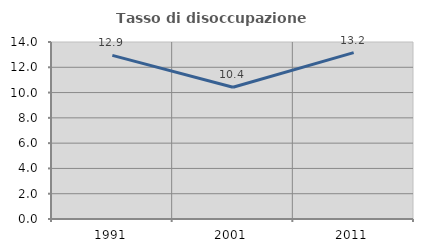
| Category | Tasso di disoccupazione giovanile  |
|---|---|
| 1991.0 | 12.941 |
| 2001.0 | 10.417 |
| 2011.0 | 13.158 |